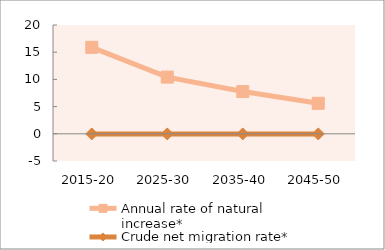
| Category | Annual rate of natural increase* | Crude net migration rate* |
|---|---|---|
| 2015-20 | 15.9 | -0.028 |
| 2025-30 | 10.423 | -0.025 |
| 2035-40 | 7.765 | -0.023 |
| 2045-50 | 5.606 | -0.021 |